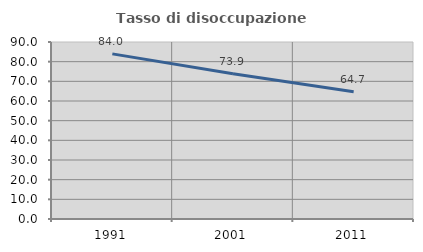
| Category | Tasso di disoccupazione giovanile  |
|---|---|
| 1991.0 | 83.961 |
| 2001.0 | 73.887 |
| 2011.0 | 64.724 |